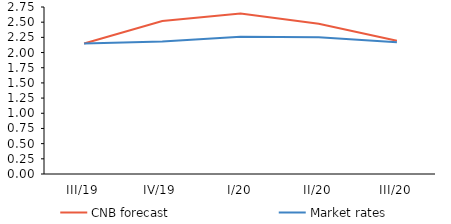
| Category | CNB forecast | Market rates |
|---|---|---|
| III/19 | 2.15 | 2.15 |
| IV/19 | 2.519 | 2.18 |
| I/20 | 2.642 | 2.26 |
| II/20 | 2.472 | 2.25 |
| III/20 | 2.196 | 2.17 |